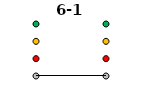
| Category | 0 | 1 | 2 | 3 | 6-1 |
|---|---|---|---|---|---|
| Time 1 | 0 | 1 | 2 | 3 | 0 |
| Time 2 | 0 | 1 | 2 | 3 | 0 |